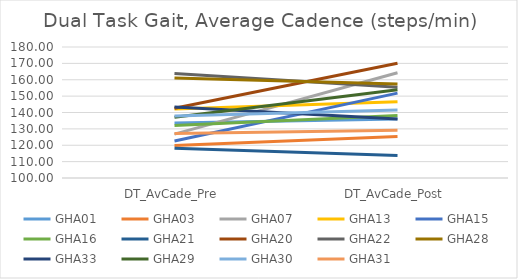
| Category | GHA01 | GHA03 | GHA07 | GHA13 | GHA15 | GHA16 | GHA21 | GHA20 | GHA22 | GHA28 | GHA33 | GHA29 | GHA30 | GHA31 |
|---|---|---|---|---|---|---|---|---|---|---|---|---|---|---|
| DT_AvCade_Pre | 133.576 | 119.904 | 126.82 | 142.102 | 122.596 | 132.071 | 118.159 | 142.554 | 163.783 | 161.084 | 143.318 | 137.038 | 137.874 | 127.202 |
| DT_AvCade_Post | 135.992 | 125.36 | 164.24 | 146.5 | 151.815 | 138.141 | 113.737 | 170.106 | 155.45 | 157.392 | 135.976 | 153.902 | 141.547 | 129.157 |